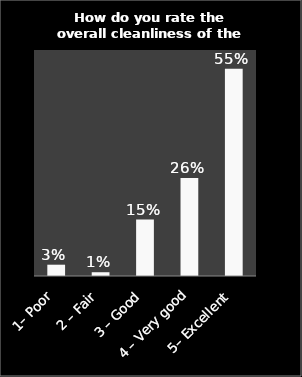
| Category | Series 0 |
|---|---|
| 1– Poor | 0.03 |
| 2 – Fair | 0.01 |
| 3 – Good | 0.15 |
| 4 – Very good | 0.26 |
| 5– Excellent | 0.55 |